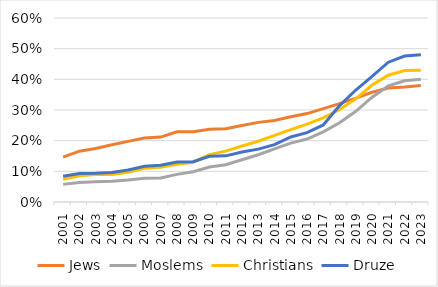
| Category | Jews | Moslems | Christians | Druze |
|---|---|---|---|---|
| 2001.0 | 0.146 | 0.057 | 0.074 | 0.084 |
| 2002.0 | 0.166 | 0.064 | 0.085 | 0.093 |
| 2003.0 | 0.174 | 0.066 | 0.09 | 0.094 |
| 2004.0 | 0.186 | 0.068 | 0.089 | 0.096 |
| 2005.0 | 0.198 | 0.072 | 0.097 | 0.104 |
| 2006.0 | 0.208 | 0.077 | 0.11 | 0.116 |
| 2007.0 | 0.212 | 0.078 | 0.113 | 0.12 |
| 2008.0 | 0.229 | 0.09 | 0.123 | 0.131 |
| 2009.0 | 0.229 | 0.099 | 0.13 | 0.132 |
| 2010.0 | 0.237 | 0.114 | 0.154 | 0.149 |
| 2011.0 | 0.239 | 0.122 | 0.166 | 0.15 |
| 2012.0 | 0.249 | 0.138 | 0.183 | 0.163 |
| 2013.0 | 0.26 | 0.154 | 0.198 | 0.172 |
| 2014.0 | 0.266 | 0.173 | 0.217 | 0.187 |
| 2015.0 | 0.278 | 0.192 | 0.236 | 0.212 |
| 2016.0 | 0.288 | 0.205 | 0.254 | 0.226 |
| 2017.0 | 0.305 | 0.229 | 0.275 | 0.251 |
| 2018.0 | 0.321 | 0.258 | 0.302 | 0.314 |
| 2019.0 | 0.339 | 0.296 | 0.336 | 0.365 |
| 2020.0 | 0.358 | 0.342 | 0.381 | 0.41 |
| 2021.0 | 0.372 | 0.379 | 0.413 | 0.456 |
| 2022.0 | 0.375 | 0.395 | 0.429 | 0.476 |
| 2023.0 | 0.38 | 0.4 | 0.43 | 0.48 |